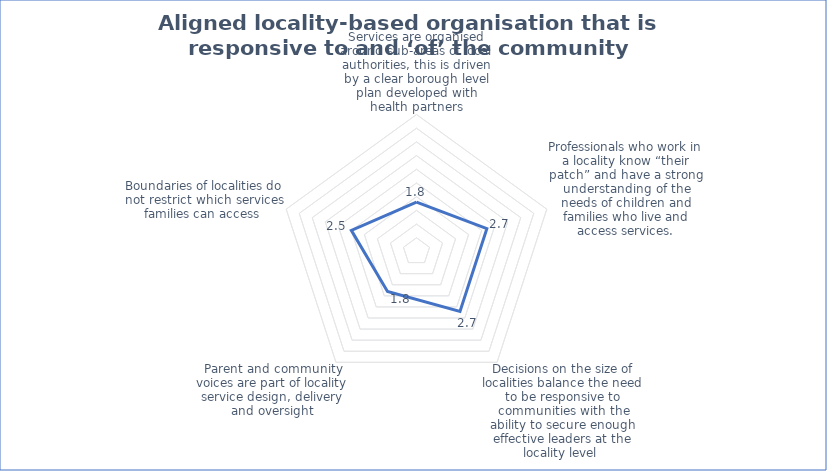
| Category | Series 0 |
|---|---|
| Services are organised around sub-areas of local authorities, this is driven by a clear borough level plan developed with health partners | 1.8 |
| Professionals who work in a locality know “their patch” and have a strong understanding of the needs of children and families who live and access services. | 2.7 |
| Decisions on the size of localities balance the need to be responsive to communities with the ability to secure enough effective leaders at the locality level  | 2.7 |
| Parent and community voices are part of locality service design, delivery and oversight | 1.8 |
| Boundaries of localities do not restrict which services families can access  | 2.5 |